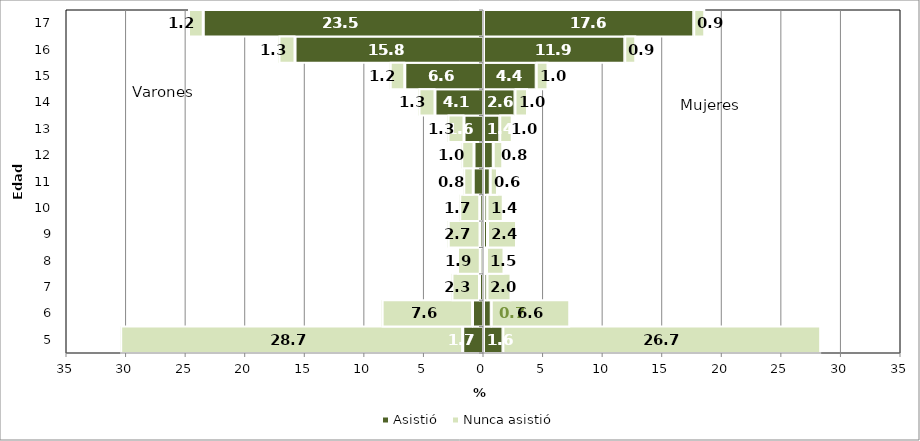
| Category | Asistió | Nunca asistió |
|---|---|---|
| 5.0 | 1.628 | 26.672 |
| 6.0 | 0.653 | 6.585 |
| 7.0 | 0.284 | 2.025 |
| 8.0 | 0.251 | 1.474 |
| 9.0 | 0.337 | 2.432 |
| 10.0 | 0.301 | 1.357 |
| 11.0 | 0.571 | 0.609 |
| 12.0 | 0.827 | 0.779 |
| 13.0 | 1.372 | 1.048 |
| 14.0 | 2.644 | 1.039 |
| 15.0 | 4.422 | 0.981 |
| 16.0 | 11.861 | 0.918 |
| 17.0 | 17.648 | 0.918 |